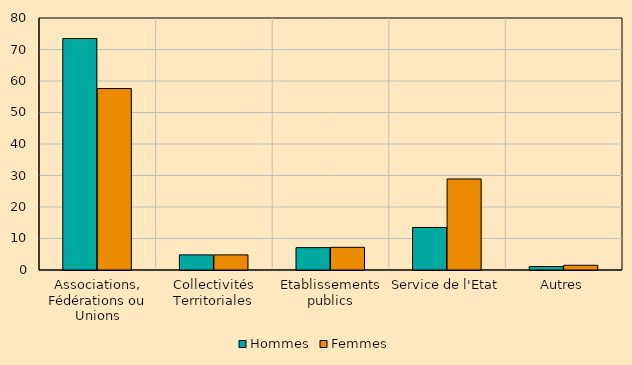
| Category | Hommes | Femmes |
|---|---|---|
| Associations, Fédérations ou Unions | 73.5 | 57.6 |
| Collectivités Territoriales | 4.8 | 4.8 |
| Etablissements publics | 7.1 | 7.2 |
| Service de l'Etat | 13.5 | 28.9 |
| Autres | 1.1 | 1.5 |